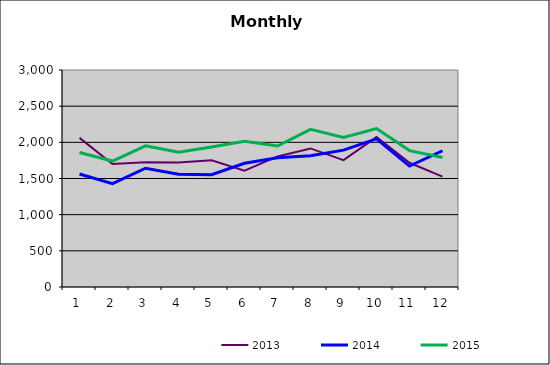
| Category | 2013 | 2014 | 2015 |
|---|---|---|---|
| 0 | 2061.224 | 1562.786 | 1860.37 |
| 1 | 1701.465 | 1428.045 | 1741.284 |
| 2 | 1724.869 | 1641.75 | 1950.694 |
| 3 | 1722.168 | 1557.532 | 1861.588 |
| 4 | 1750.754 | 1551.352 | 1936.026 |
| 5 | 1609.116 | 1711.075 | 2014.007 |
| 6 | 1804.984 | 1785.989 | 1948.962 |
| 7 | 1915.765 | 1815.515 | 2180.161 |
| 8 | 1753.392 | 1892.134 | 2068.473 |
| 9 | 2072.87 | 2048.585 | 2190.215 |
| 10 | 1717.303 | 1671.323 | 1885.651 |
| 11 | 1525.855 | 1883.808 | 1789.447 |